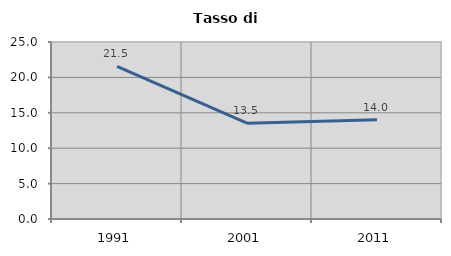
| Category | Tasso di disoccupazione   |
|---|---|
| 1991.0 | 21.549 |
| 2001.0 | 13.54 |
| 2011.0 | 14.022 |